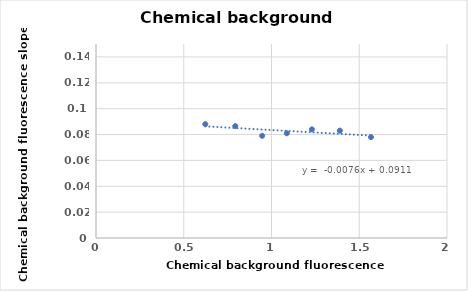
| Category | Series 0 |
|---|---|
| 0.6228 | 0.088 |
| 0.7936 | 0.086 |
| 0.9468 | 0.079 |
| 1.0874 | 0.081 |
| 1.2302 | 0.084 |
| 1.3896 | 0.083 |
| 1.5669 | 0.078 |